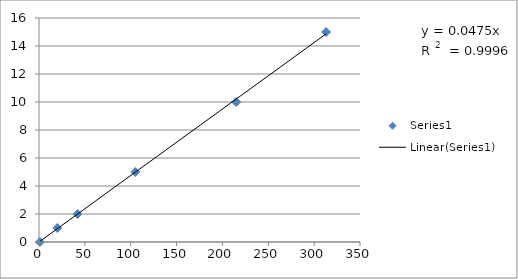
| Category | Series 0 |
|---|---|
| 1.0 | 0 |
| 20.0 | 1 |
| 42.0 | 2 |
| 105.0 | 5 |
| 215.0 | 10 |
| 313.0 | 15 |